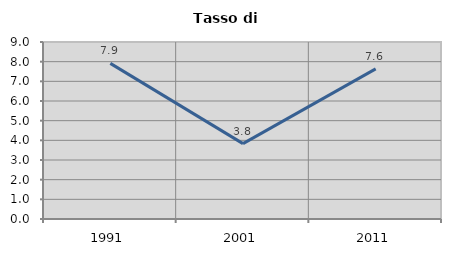
| Category | Tasso di disoccupazione   |
|---|---|
| 1991.0 | 7.914 |
| 2001.0 | 3.832 |
| 2011.0 | 7.636 |